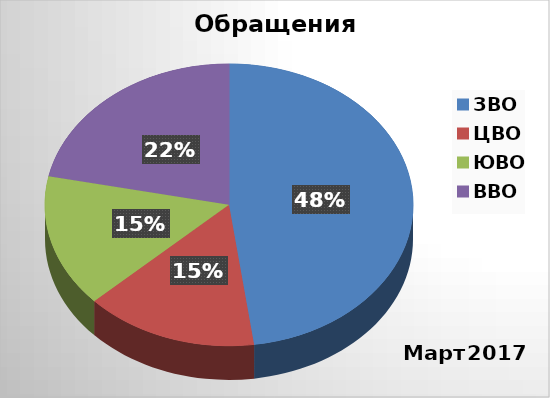
| Category | Series 0 |
|---|---|
| ЗВО | 22 |
| ЦВО | 7 |
| ЮВО | 7 |
| ВВО | 10 |